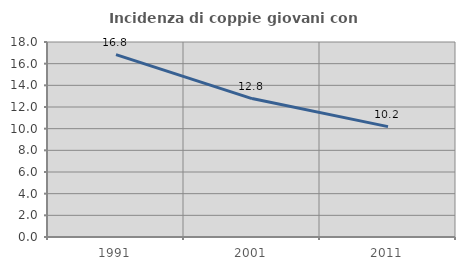
| Category | Incidenza di coppie giovani con figli |
|---|---|
| 1991.0 | 16.832 |
| 2001.0 | 12.779 |
| 2011.0 | 10.188 |